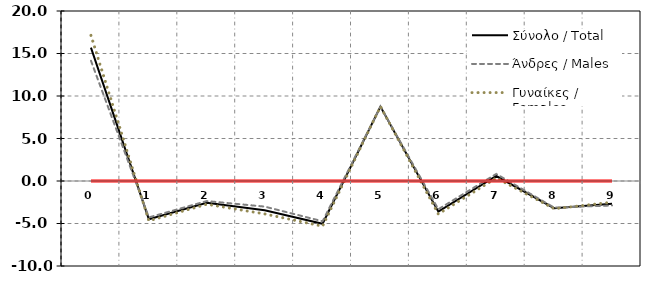
| Category | Σύνολο / Total | Άνδρες / Males | Γυναίκες / Females | Μηδέν / Zero |
|---|---|---|---|---|
| 0 | 15.687 | 14.154 | 17.133 | 0 |
| 1 | -4.49 | -4.284 | -4.684 | 0 |
| 2 | -2.554 | -2.362 | -2.735 | 0 |
| 3 | -3.454 | -3.011 | -3.871 | 0 |
| 4 | -5.036 | -4.737 | -5.317 | 0 |
| 5 | 8.754 | 8.743 | 8.765 | 0 |
| 6 | -3.613 | -3.325 | -3.885 | 0 |
| 7 | 0.588 | 0.833 | 0.357 | 0 |
| 8 | -3.201 | -3.134 | -3.264 | 0 |
| 9 | -2.683 | -2.877 | -2.499 | 0 |